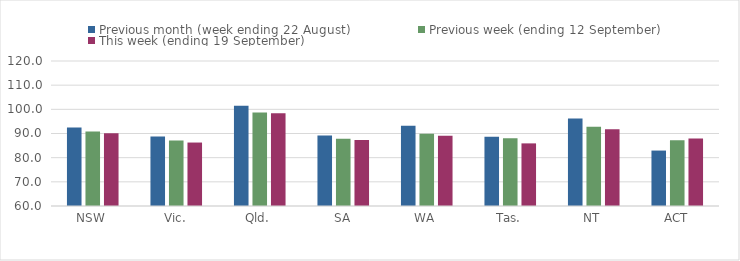
| Category | Previous month (week ending 22 August) | Previous week (ending 12 September) | This week (ending 19 September) |
|---|---|---|---|
| NSW | 92.47 | 90.82 | 90.08 |
| Vic. | 88.71 | 87.09 | 86.26 |
| Qld. | 101.53 | 98.67 | 98.39 |
| SA | 89.22 | 87.82 | 87.32 |
| WA | 93.24 | 89.88 | 89.05 |
| Tas. | 88.63 | 88.07 | 85.91 |
| NT | 96.25 | 92.83 | 91.75 |
| ACT | 82.94 | 87.2 | 87.98 |